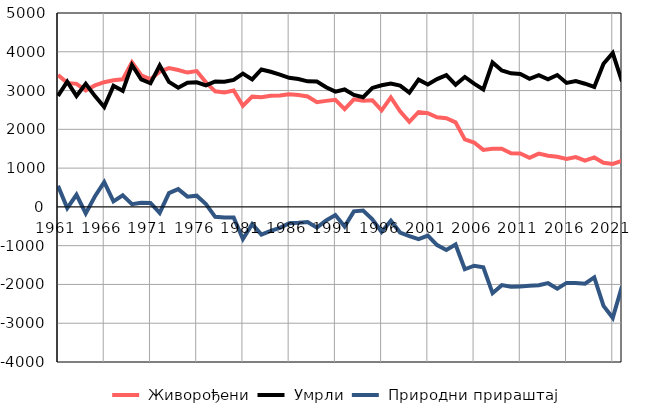
| Category |  Живорођени |  Умрли |  Природни прираштај |
|---|---|---|---|
| 1961.0 | 3402 | 2860 | 542 |
| 1962.0 | 3198 | 3229 | -31 |
| 1963.0 | 3173 | 2860 | 313 |
| 1964.0 | 3004 | 3173 | -169 |
| 1965.0 | 3132 | 2857 | 275 |
| 1966.0 | 3215 | 2575 | 640 |
| 1967.0 | 3264 | 3121 | 143 |
| 1968.0 | 3289 | 2992 | 297 |
| 1969.0 | 3730 | 3659 | 71 |
| 1970.0 | 3394 | 3286 | 108 |
| 1971.0 | 3290 | 3187 | 103 |
| 1972.0 | 3489 | 3645 | -156 |
| 1973.0 | 3578 | 3222 | 356 |
| 1974.0 | 3529 | 3072 | 457 |
| 1975.0 | 3464 | 3200 | 264 |
| 1976.0 | 3503 | 3213 | 290 |
| 1977.0 | 3211 | 3136 | 75 |
| 1978.0 | 2980 | 3236 | -256 |
| 1979.0 | 2953 | 3229 | -276 |
| 1980.0 | 3002 | 3276 | -274 |
| 1981.0 | 2609 | 3436 | -827 |
| 1982.0 | 2843 | 3289 | -446 |
| 1983.0 | 2830 | 3544 | -714 |
| 1984.0 | 2866 | 3484 | -618 |
| 1985.0 | 2870 | 3410 | -540 |
| 1986.0 | 2905 | 3328 | -423 |
| 1987.0 | 2885 | 3296 | -411 |
| 1988.0 | 2846 | 3237 | -391 |
| 1989.0 | 2698 | 3233 | -535 |
| 1990.0 | 2734 | 3085 | -351 |
| 1991.0 | 2762 | 2972 | -210 |
| 1992.0 | 2521 | 3028 | -507 |
| 1993.0 | 2774 | 2889 | -115 |
| 1994.0 | 2735 | 2829 | -94 |
| 1995.0 | 2750 | 3068 | -318 |
| 1996.0 | 2489 | 3137 | -648 |
| 1997.0 | 2822 | 3180 | -358 |
| 1998.0 | 2464 | 3126 | -662 |
| 1999.0 | 2193 | 2945 | -752 |
| 2000.0 | 2447 | 3280 | -833 |
| 2001.0 | 2416 | 3156 | -740 |
| 2002.0 | 2311 | 3296 | -985 |
| 2003.0 | 2287 | 3400 | -1113 |
| 2004.0 | 2181 | 3152 | -971 |
| 2005.0 | 1742 | 3351 | -1609 |
| 2006.0 | 1660 | 3178 | -1518 |
| 2007.0 | 1470 | 3030 | -1560 |
| 2008.0 | 1499 | 3724 | -2225 |
| 2009.0 | 1501 | 3519 | -2018 |
| 2010.0 | 1385 | 3445 | -2060 |
| 2011.0 | 1378 | 3428 | -2050 |
| 2012.0 | 1266 | 3301 | -2035 |
| 2013.0 | 1375 | 3395 | -2020 |
| 2014.0 | 1321 | 3288 | -1967 |
| 2015.0 | 1292 | 3400 | -2108 |
| 2016.0 | 1237 | 3197 | -1960 |
| 2017.0 | 1284 | 3245 | -1961 |
| 2018.0 | 1195 | 3176 | -1981 |
| 2019.0 | 1275 | 3093 | -1818 |
| 2020.0 | 1137 | 3690 | -2553 |
| 2021.0 | 1107 | 3968 | -2861 |
| 2022.0 | 1186 | 3235 | -2049 |